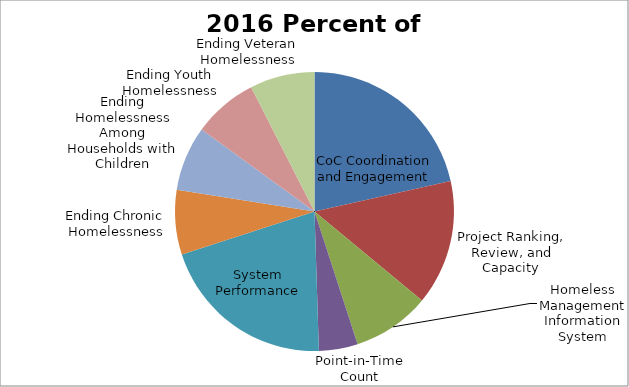
| Category | Percent of Points |
|---|---|
| CoC Coordination and Engagement | 0.214 |
| Project Ranking, Review, and Capacity | 0.144 |
| Homeless Management Information System | 0.09 |
| Point-in-Time Count | 0.045 |
| System Performance | 0.204 |
| Ending Chronic Homelessness | 0.075 |
| Ending Homelessness Among Households with Children | 0.075 |
| Ending Youth Homelessness | 0.075 |
| Ending Veteran Homelessness | 0.075 |